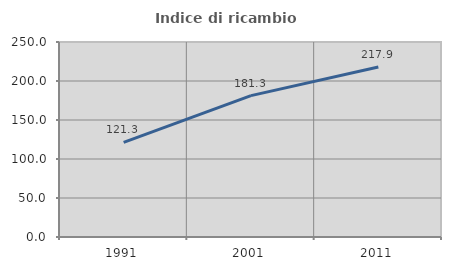
| Category | Indice di ricambio occupazionale  |
|---|---|
| 1991.0 | 121.283 |
| 2001.0 | 181.272 |
| 2011.0 | 217.871 |